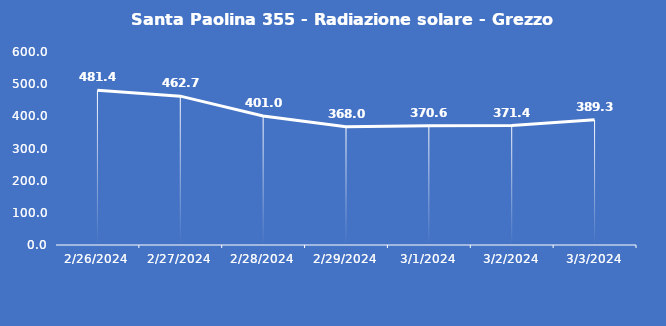
| Category | Santa Paolina 355 - Radiazione solare - Grezzo (W/m2) |
|---|---|
| 2/26/24 | 481.4 |
| 2/27/24 | 462.7 |
| 2/28/24 | 401 |
| 2/29/24 | 368 |
| 3/1/24 | 370.6 |
| 3/2/24 | 371.4 |
| 3/3/24 | 389.3 |